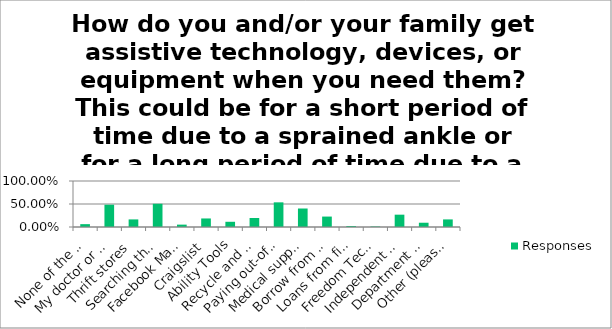
| Category | Responses |
|---|---|
| None of the above | 0.062 |
| My doctor or health care provider | 0.484 |
| Thrift stores | 0.165 |
| Searching the internet | 0.505 |
| Facebook Marketplace | 0.052 |
| Craigslist | 0.186 |
| Ability Tools | 0.113 |
| Recycle and Reuse Programs | 0.196 |
| Paying out-of-pocket | 0.536 |
| Medical supply stores | 0.402 |
| Borrow from friends of family | 0.227 |
| Loans from financial institutions | 0.021 |
| Freedom Tech Financial Loan Program | 0.01 |
| Independent Living Center | 0.268 |
| Department of Rehabilitation | 0.093 |
| Other (please specify) | 0.165 |